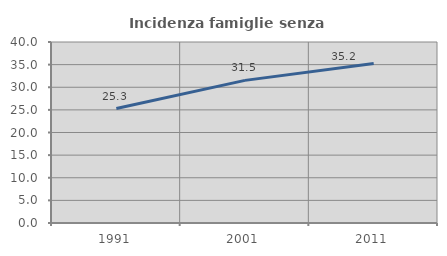
| Category | Incidenza famiglie senza nuclei |
|---|---|
| 1991.0 | 25.293 |
| 2001.0 | 31.519 |
| 2011.0 | 35.233 |